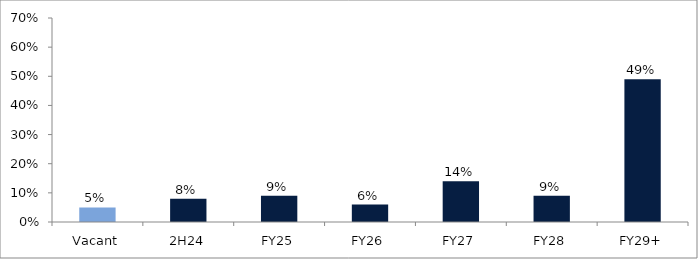
| Category | Series 0 |
|---|---|
| Vacant | 0.05 |
| 2H24 | 0.08 |
| FY25 | 0.09 |
| FY26 | 0.06 |
| FY27 | 0.14 |
| FY28 | 0.09 |
| FY29+ | 0.49 |